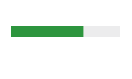
| Category | Series 0 | Series 1 |
|---|---|---|
| 0 | 0 | 0 |
| 1 | 0.667 | 0.333 |
| 2 | 0 | 0 |